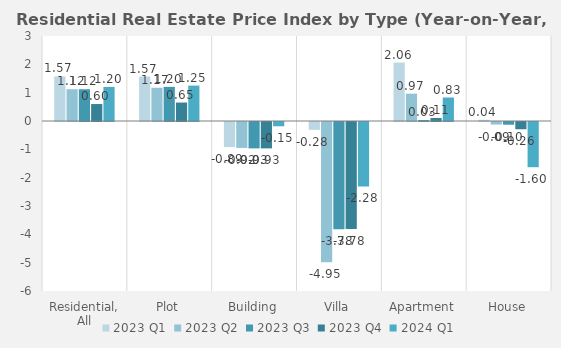
| Category | 2023 | 2024 |
|---|---|---|
| Residential, All | 0.599 | 1.202 |
| Plot | 0.651 | 1.25 |
| Building | -0.931 | -0.151 |
| Villa | -3.78 | -2.275 |
| Apartment | 0.107 | 0.829 |
| House | -0.256 | -1.596 |